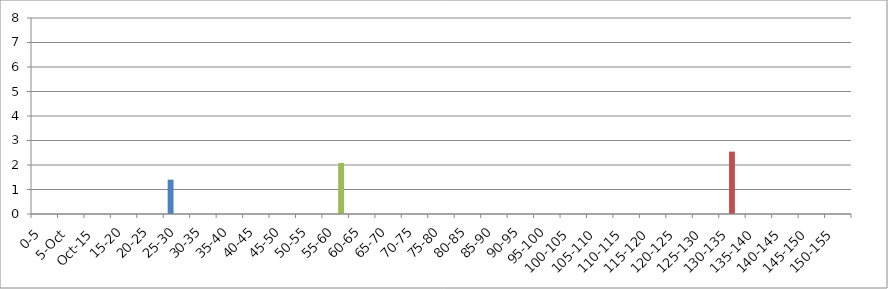
| Category | 119875 | 146067 | 241240 |
|---|---|---|---|
| 0-5 | 0 | 0 | 0 |
| 5-Oct | 0 | 0 | 0 |
| Oct-15 | 0 | 0 | 0 |
| 15-20 | 0 | 0 | 0 |
| 20-25 | 0 | 0 | 0 |
| 25-30 | 1.402 | 0 | 0 |
| 30-35 | 0 | 0 | 0 |
| 35-40 | 0 | 0 | 0 |
| 40-45 | 0 | 0 | 0 |
| 45-50 | 0 | 0 | 0 |
| 50-55 | 0 | 0 | 0 |
| 55-60 | 0 | 0 | 2.084 |
| 60-65 | 0 | 0 | 0 |
| 65-70 | 0 | 0 | 0 |
| 70-75 | 0 | 0 | 0 |
| 75-80 | 0 | 0 | 0 |
| 80-85 | 0 | 0 | 0 |
| 85-90 | 0 | 0 | 0 |
| 90-95 | 0 | 0 | 0 |
| 95-100 | 0 | 0 | 0 |
| 100-105 | 0 | 0 | 0 |
| 105-110 | 0 | 0 | 0 |
| 110-115 | 0 | 0 | 0 |
| 115-120 | 0 | 0 | 0 |
| 120-125 | 0 | 0 | 0 |
| 125-130 | 0 | 0 | 0 |
| 130-135 | 0 | 2.546 | 0 |
| 135-140 | 0 | 0 | 0 |
| 140-145 | 0 | 0 | 0 |
| 145-150 | 0 | 0 | 0 |
| 150-155 | 0 | 0 | 0 |